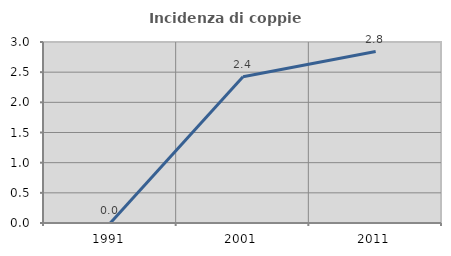
| Category | Incidenza di coppie miste |
|---|---|
| 1991.0 | 0 |
| 2001.0 | 2.424 |
| 2011.0 | 2.841 |